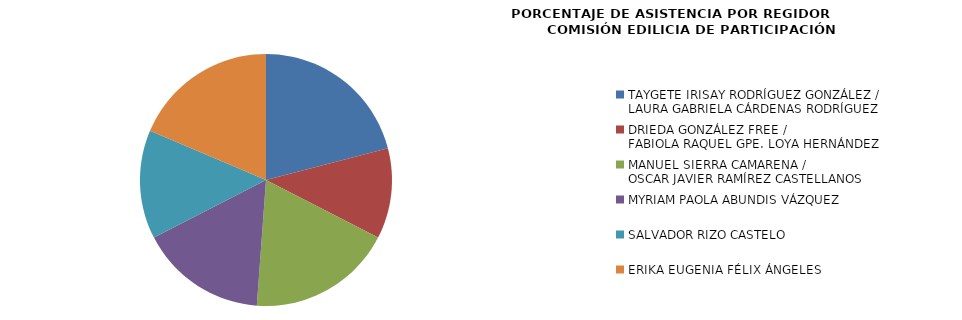
| Category | Series 0 |
|---|---|
| TAYGETE IRISAY RODRÍGUEZ GONZÁLEZ /
LAURA GABRIELA CÁRDENAS RODRÍGUEZ | 100 |
| DRIEDA GONZÁLEZ FREE /
FABIOLA RAQUEL GPE. LOYA HERNÁNDEZ | 55.556 |
| MANUEL SIERRA CAMARENA /
OSCAR JAVIER RAMÍREZ CASTELLANOS | 88.889 |
| MYRIAM PAOLA ABUNDIS VÁZQUEZ | 77.778 |
| SALVADOR RIZO CASTELO | 66.667 |
| ERIKA EUGENIA FÉLIX ÁNGELES | 88.889 |